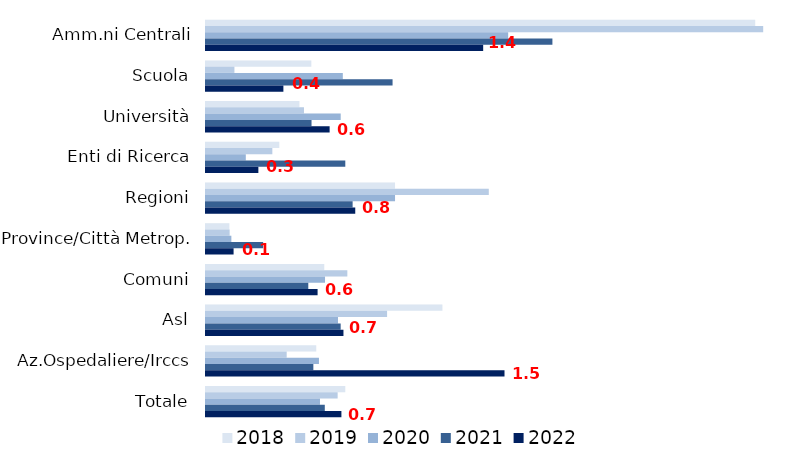
| Category | 2018 | 2019 | 2020 | 2021 | 2022 |
|---|---|---|---|---|---|
| Amm.ni Centrali | 2.76 | 2.8 | 1.519 | 1.741 | 1.393 |
| Scuola | 0.529 | 0.143 | 0.688 | 0.938 | 0.389 |
| Università | 0.47 | 0.492 | 0.677 | 0.53 | 0.621 |
| Enti di Ricerca | 0.368 | 0.333 | 0.2 | 0.7 | 0.263 |
| Regioni | 0.95 | 1.421 | 0.95 | 0.737 | 0.75 |
| Province/Città Metrop. | 0.118 | 0.119 | 0.127 | 0.287 | 0.139 |
| Comuni | 0.594 | 0.71 | 0.598 | 0.514 | 0.561 |
| Asl | 1.188 | 0.91 | 0.663 | 0.677 | 0.691 |
| Az.Ospedaliere/Irccs | 0.554 | 0.405 | 0.568 | 0.539 | 1.5 |
| Totale | 0.7 | 0.662 | 0.573 | 0.597 | 0.68 |